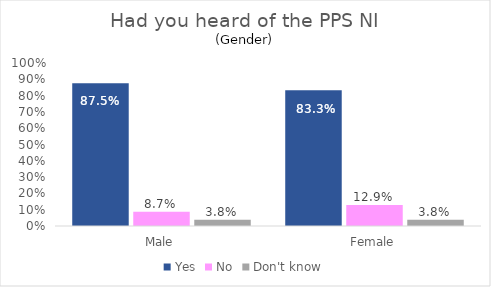
| Category | Yes | No | Don't know |
|---|---|---|---|
| Male | 0.875 | 0.087 | 0.038 |
| Female | 0.833 | 0.129 | 0.038 |